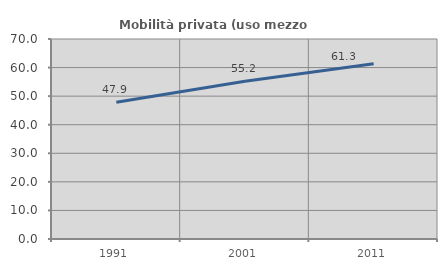
| Category | Mobilità privata (uso mezzo privato) |
|---|---|
| 1991.0 | 47.876 |
| 2001.0 | 55.241 |
| 2011.0 | 61.307 |